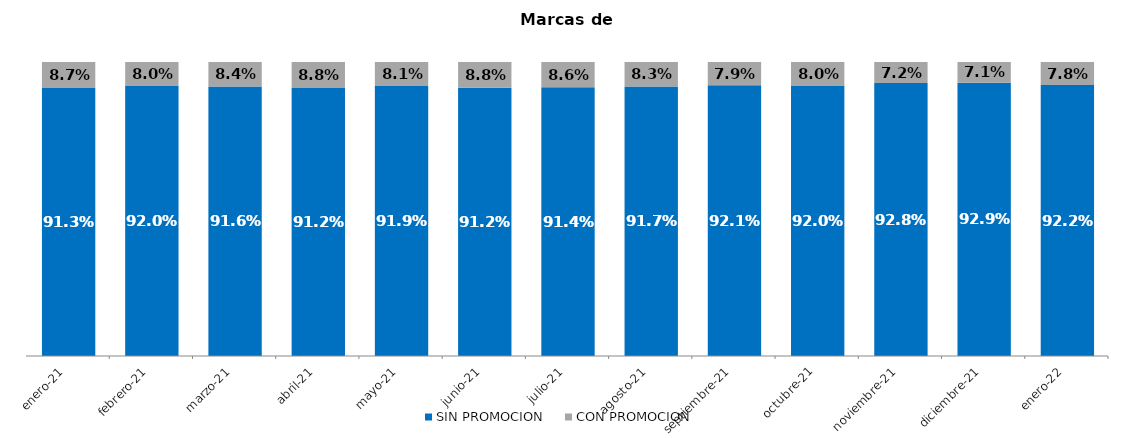
| Category | SIN PROMOCION   | CON PROMOCION   |
|---|---|---|
| 2021-01-01 | 0.913 | 0.087 |
| 2021-02-01 | 0.92 | 0.08 |
| 2021-03-01 | 0.916 | 0.084 |
| 2021-04-01 | 0.912 | 0.088 |
| 2021-05-01 | 0.919 | 0.081 |
| 2021-06-01 | 0.912 | 0.088 |
| 2021-07-01 | 0.914 | 0.086 |
| 2021-08-01 | 0.917 | 0.083 |
| 2021-09-01 | 0.921 | 0.079 |
| 2021-10-01 | 0.92 | 0.08 |
| 2021-11-01 | 0.928 | 0.072 |
| 2021-12-01 | 0.929 | 0.071 |
| 2022-01-01 | 0.922 | 0.078 |